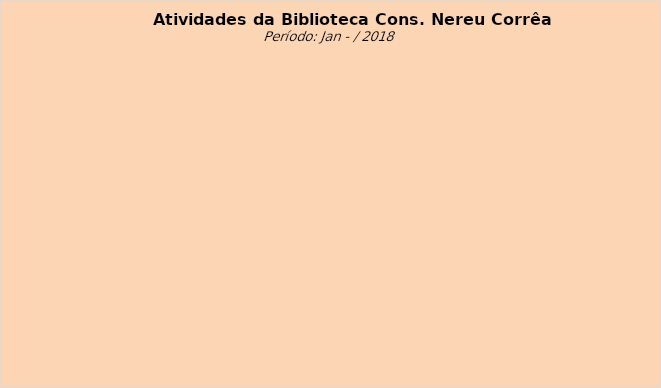
| Category | Series 0 |
|---|---|
| ATENDIMENTO | 0 |
| EMPRÉSTIMO DOMICILIAR POR TIPO DE USUÁRIO | 0 |
| PROCESSO TÉCNICO | 0 |
| SERVIÇOS ADMINISTRATIVOS | 0 |
| OUTROS | 0 |